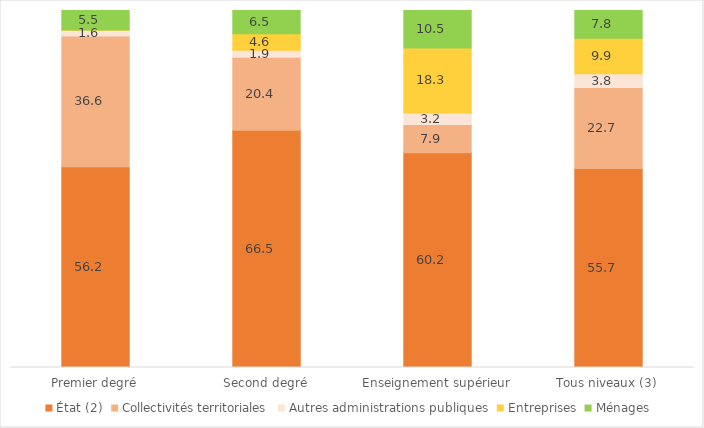
| Category | État (2) | Collectivités territoriales | Autres administrations publiques | Entreprises | Ménages  |
|---|---|---|---|---|---|
| Premier degré | 56.236 | 36.625 | 1.641 | 0.023 | 5.475 |
| Second degré | 66.466 | 20.431 | 1.938 | 4.63 | 6.534 |
| Enseignement supérieur | 60.172 | 7.868 | 3.228 | 18.261 | 10.47 |
| Tous niveaux (3) | 55.716 | 22.739 | 3.835 | 9.934 | 7.776 |